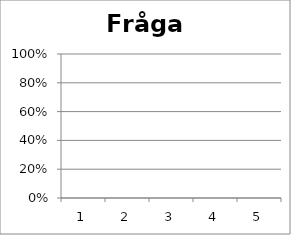
| Category | Fråga 5 |
|---|---|
| 0 | 0 |
| 1 | 0 |
| 2 | 0 |
| 3 | 0 |
| 4 | 0 |